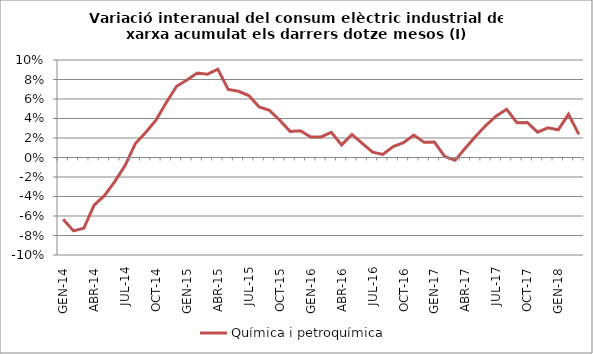
| Category | Química i petroquímica |
|---|---|
| GEN-14 | -0.063 |
| FEB-14 | -0.075 |
| MAR-14 | -0.073 |
| ABR-14 | -0.049 |
| MAI-14 | -0.039 |
| JUN-14 | -0.025 |
| JUL-14 | -0.008 |
| AGO-14 | 0.014 |
| SET-14 | 0.026 |
| OCT-14 | 0.038 |
| NOV-14 | 0.056 |
| DES-14 | 0.073 |
| GEN-15 | 0.079 |
| FEB-15 | 0.087 |
| MAR-15 | 0.085 |
| ABR-15 | 0.091 |
| MAI-15 | 0.07 |
| JUN-15 | 0.068 |
| JUL-15 | 0.064 |
| AGO-15 | 0.052 |
| SET-15 | 0.048 |
| OCT-15 | 0.038 |
| NOV-15 | 0.027 |
| DES-15 | 0.028 |
| GEN-16 | 0.021 |
| FEB-16 | 0.021 |
| MAR-16 | 0.026 |
| ABR-16 | 0.013 |
| MAI-16 | 0.024 |
| JUN-16 | 0.015 |
| JUL-16 | 0.005 |
| AGO-16 | 0.003 |
| SET-16 | 0.011 |
| OCT-16 | 0.015 |
| NOV-16 | 0.023 |
| DES-16 | 0.016 |
| GEN-17 | 0.016 |
| FEB-17 | 0.001 |
| MAR-17 | -0.003 |
| ABR-17 | 0.01 |
| MAI-17 | 0.022 |
| JUN-17 | 0.033 |
| JUL-17 | 0.043 |
| AGO-17 | 0.049 |
| SET-17 | 0.036 |
| OCT-17 | 0.036 |
| NOV-17 | 0.026 |
| DES-17 | 0.03 |
| GEN-18 | 0.028 |
| FEB-18 | 0.044 |
| MAR-18 | 0.024 |